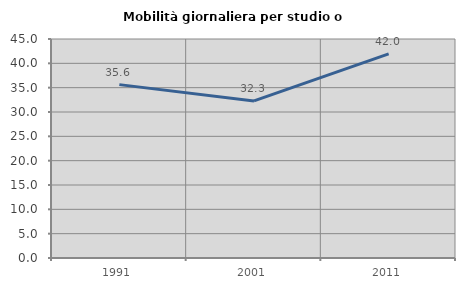
| Category | Mobilità giornaliera per studio o lavoro |
|---|---|
| 1991.0 | 35.626 |
| 2001.0 | 32.278 |
| 2011.0 | 41.957 |